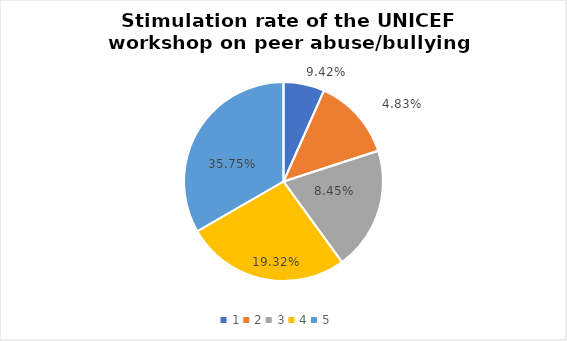
| Category | Series 0 | Series 1 |
|---|---|---|
| 0 | 1 | 0.094 |
| 1 | 2 | 0.048 |
| 2 | 3 | 0.085 |
| 3 | 4 | 0.193 |
| 4 | 5 | 0.357 |